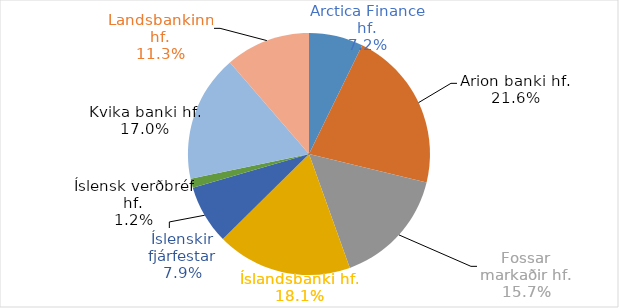
| Category | Total % |
|---|---|
| Arctica Finance hf. | 0.072 |
| Arion banki hf. | 0.216 |
| Fossar markaðir hf. | 0.157 |
| Íslandsbanki hf. | 0.181 |
| Íslenskir fjárfestar | 0.079 |
| Íslensk verðbréf hf. | 0.012 |
| Kvika banki hf. | 0.17 |
| Landsbankinn hf. | 0.113 |